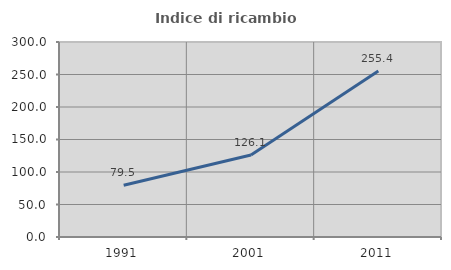
| Category | Indice di ricambio occupazionale  |
|---|---|
| 1991.0 | 79.511 |
| 2001.0 | 126.112 |
| 2011.0 | 255.357 |